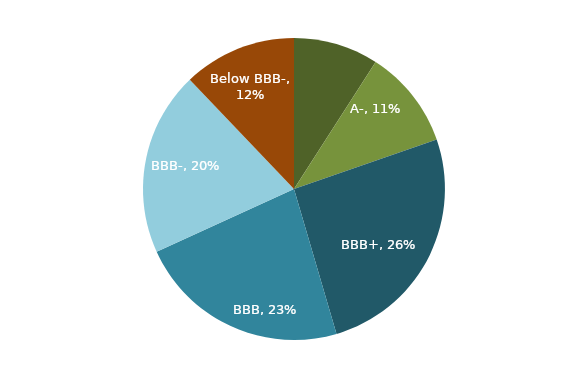
| Category | Series 0 |
|---|---|
| A or higher | 0.091 |
| A- | 0.106 |
| BBB+ | 0.258 |
| BBB | 0.227 |
| BBB- | 0.197 |
| Below BBB- | 0.121 |